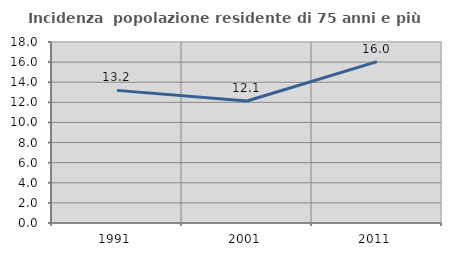
| Category | Incidenza  popolazione residente di 75 anni e più |
|---|---|
| 1991.0 | 13.189 |
| 2001.0 | 12.128 |
| 2011.0 | 16.047 |